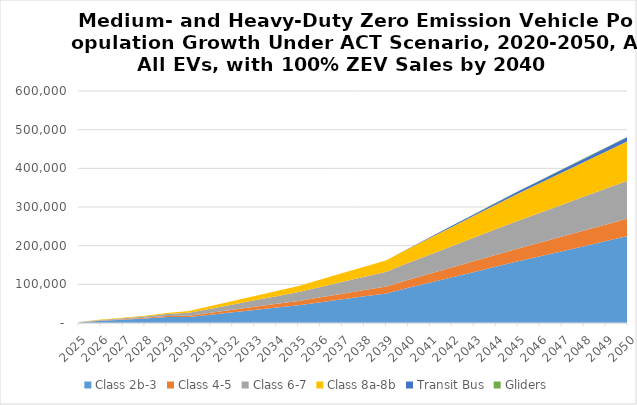
| Category | Class 2b-3 | Class 4-5 | Class 6-7 | Class 8a-8b | Transit Bus | Gliders |
|---|---|---|---|---|---|---|
| 2025.0 | 1418.407 | 321.977 | 599.773 | 380.25 | 0 | 0 |
| 2026.0 | 5974.69 | 699.011 | 1310.856 | 808.163 | 0 | 0 |
| 2027.0 | 8631.61 | 1161.388 | 2192.154 | 1311.49 | 0 | 0 |
| 2028.0 | 11766.267 | 1795.636 | 3410.77 | 1936.774 | 0 | 0 |
| 2029.0 | 15455.094 | 2644.143 | 5053.366 | 2717.701 | 0 | 0 |
| 2030.0 | 15250.975 | 3806.617 | 7318.484 | 4348.858 | 0 | 0 |
| 2031.0 | 21434.888 | 5254.378 | 10420.668 | 6660.963 | 0 | 0 |
| 2032.0 | 27618.801 | 6702.14 | 13522.853 | 8973.068 | 0 | 0 |
| 2033.0 | 33802.714 | 8149.902 | 16625.038 | 11285.172 | 0 | 0 |
| 2034.0 | 39986.626 | 9597.664 | 19727.222 | 13597.277 | 0 | 0 |
| 2035.0 | 46170.539 | 11045.426 | 22829.407 | 15909.382 | 0 | 0 |
| 2036.0 | 53757.896 | 12738.727 | 26727.947 | 19299.108 | 0 | 0 |
| 2037.0 | 61345.252 | 14432.028 | 30626.487 | 22688.834 | 0 | 0 |
| 2038.0 | 68932.608 | 16125.329 | 34525.027 | 26078.56 | 0 | 0 |
| 2039.0 | 76519.964 | 17818.63 | 38423.567 | 29468.286 | 0 | 0 |
| 2040.0 | 91235.8 | 20306.08 | 44050.7 | 36333.217 | 867.638 | 87.08 |
| 2041.0 | 104894.269 | 22873.432 | 49626.151 | 43147.486 | 1799.194 | 173.65 |
| 2042.0 | 118552.737 | 25440.785 | 55201.602 | 49961.756 | 2730.749 | 260.22 |
| 2043.0 | 132211.206 | 28008.137 | 60777.052 | 56776.025 | 3662.305 | 346.79 |
| 2044.0 | 145869.674 | 30575.489 | 66352.503 | 63590.295 | 4593.86 | 433.361 |
| 2045.0 | 159528.143 | 33142.841 | 71927.953 | 70404.565 | 5525.416 | 519.931 |
| 2046.0 | 172614.951 | 35631.017 | 77105.868 | 76777.502 | 6572.347 | 604.566 |
| 2047.0 | 185701.76 | 38119.192 | 82283.783 | 83150.439 | 7619.279 | 689.202 |
| 2048.0 | 198788.568 | 40607.368 | 87461.698 | 89523.377 | 8666.21 | 773.837 |
| 2049.0 | 211875.376 | 43095.543 | 92639.613 | 95896.314 | 9713.142 | 858.472 |
| 2050.0 | 224962.185 | 45583.719 | 97817.528 | 102269.252 | 10760.073 | 943.108 |